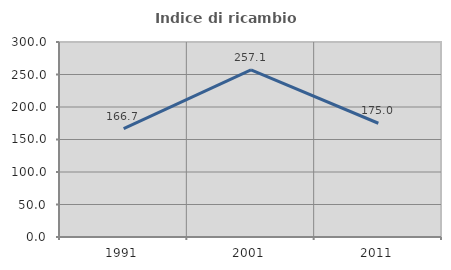
| Category | Indice di ricambio occupazionale  |
|---|---|
| 1991.0 | 166.667 |
| 2001.0 | 257.143 |
| 2011.0 | 175 |